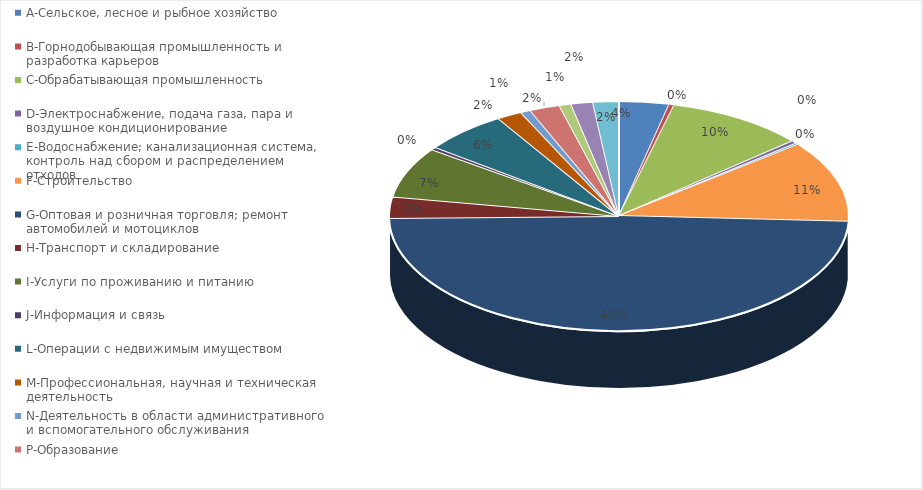
| Category | Series 0 |
|---|---|
| A-Сельское, лесное и рыбное хозяйство | 0.035 |
| B-Горнодобывающая промышленность и разработка карьеров | 0.004 |
| C-Обрабатывающая промышленность | 0.098 |
| D-Электроснабжение, подача газа, пара и воздушное кондиционирование | 0.004 |
| E-Водоснабжение; канализационная система, контроль над сбором и распределением отходов | 0.002 |
| F-Строительство | 0.115 |
| G-Оптовая и розничная торговля; ремонт автомобилей и мотоциклов | 0.49 |
| H-Транспорт и складирование | 0.03 |
| I-Услуги по проживанию и питанию | 0.071 |
| J-Информация и связь | 0.004 |
| L-Операции с недвижимым имуществом | 0.059 |
| M-Профессиональная, научная и техническая деятельность | 0.018 |
| N-Деятельность в области административного и вспомогательного обслуживания | 0.007 |
| P-Образование | 0.021 |
| Q-Здравоохранение и социальные услуги | 0.008 |
| R-Искусство, развлечения и отдых | 0.015 |
| S-Предоставление прочих видов услуг | 0.018 |